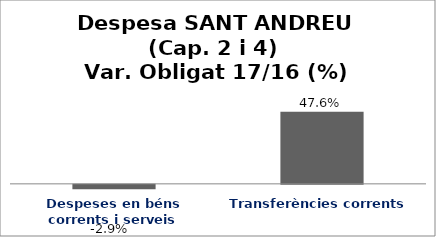
| Category | Series 0 |
|---|---|
| Despeses en béns corrents i serveis | -0.029 |
| Transferències corrents | 0.476 |